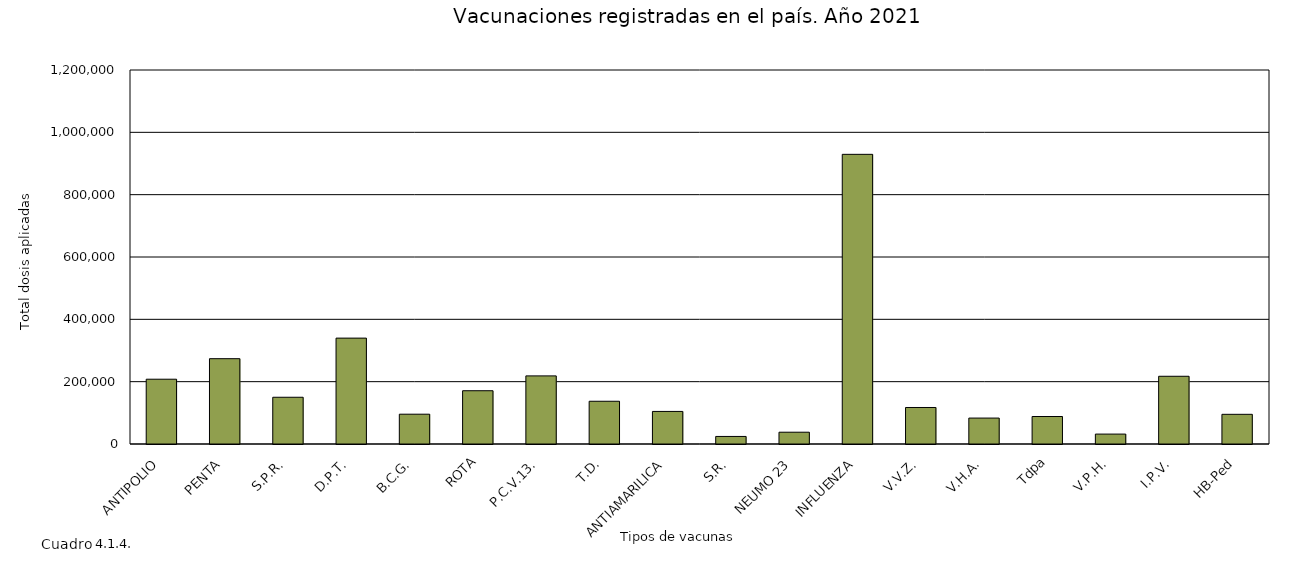
| Category | 2021 |
|---|---|
| ANTIPOLIO | 207871 |
| PENTA | 273742 |
| S.P.R. | 149988 |
| D.P.T. | 339742 |
| B.C.G. | 95621 |
| ROTA | 170932 |
| P.C.V.13. | 218560 |
| T.D. | 137159 |
| ANTIAMARILICA | 104491 |
| S.R. | 24250 |
| NEUMO 23 | 37839 |
| INFLUENZA | 929400 |
| V.V.Z. | 117113 |
| V.H.A. | 83183 |
| Tdpa | 88222 |
| V.P.H. | 31785 |
| I.P.V. | 217298 |
| HB-Ped | 95240 |